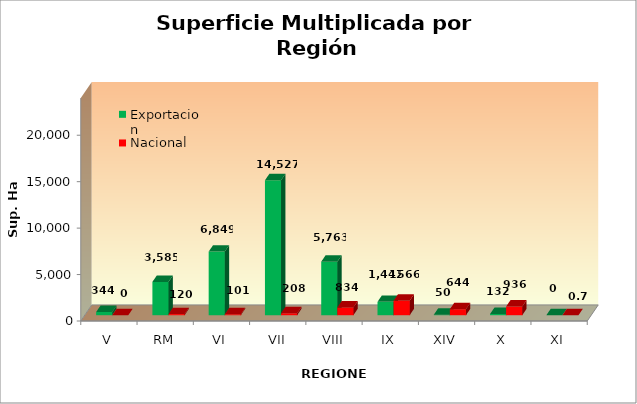
| Category | Exportacion | Nacional |
|---|---|---|
| V | 344 | 0 |
| RM | 3585 | 120 |
| VI | 6849 | 101 |
| VII | 14527 | 208 |
| VIII | 5763 | 834 |
| IX | 1442 | 1566 |
| XIV | 50 | 644 |
| X | 132 | 936 |
| XI | 0 | 0.7 |